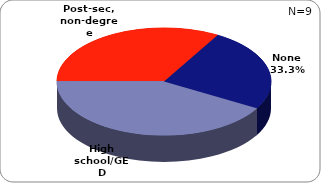
| Category | Series 0 |
|---|---|
| None | 0.333 |
| High school/GED | 0.556 |
| Post-sec, non-degree | 0.444 |